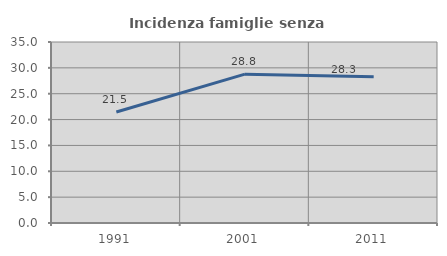
| Category | Incidenza famiglie senza nuclei |
|---|---|
| 1991.0 | 21.46 |
| 2001.0 | 28.777 |
| 2011.0 | 28.289 |